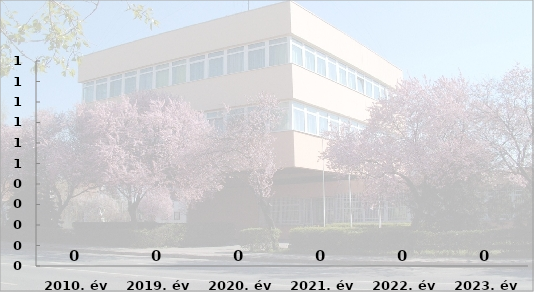
| Category | Illegális migrációhoz kapcsolódó jogellenes cselekmények száma |
|---|---|
| 2010. év | 0 |
| 2019. év | 0 |
| 2020. év | 0 |
| 2021. év | 0 |
| 2022. év | 0 |
| 2023. év | 0 |